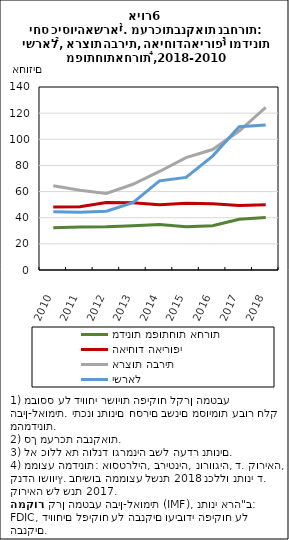
| Category | מדינות מפותחות אחרות | האיחוד האירופי | ארצות הברית | ישראל |
|---|---|---|---|---|
| 2010.0 | 32.351 | 48.157 | 64.473 | 44.654 |
| 2011.0 | 32.817 | 48.437 | 60.978 | 44.13 |
| 2012.0 | 32.994 | 51.658 | 58.549 | 45.017 |
| 2013.0 | 33.816 | 51.515 | 65.587 | 51.568 |
| 2014.0 | 34.765 | 49.985 | 75.389 | 68.194 |
| 2015.0 | 33.178 | 51.138 | 85.972 | 70.846 |
| 2016.0 | 33.939 | 50.7 | 92.175 | 87.176 |
| 2017.0 | 38.87 | 49.434 | 106.302 | 109.558 |
| 2018.0 | 40.098 | 49.91 | 124.392 | 110.942 |